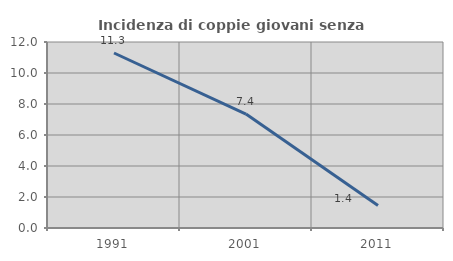
| Category | Incidenza di coppie giovani senza figli |
|---|---|
| 1991.0 | 11.29 |
| 2001.0 | 7.353 |
| 2011.0 | 1.449 |